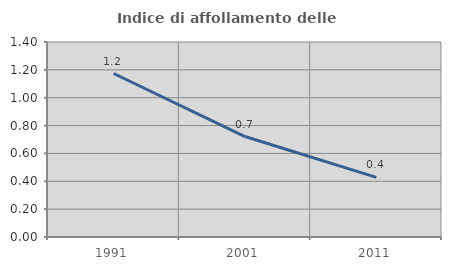
| Category | Indice di affollamento delle abitazioni  |
|---|---|
| 1991.0 | 1.174 |
| 2001.0 | 0.721 |
| 2011.0 | 0.428 |